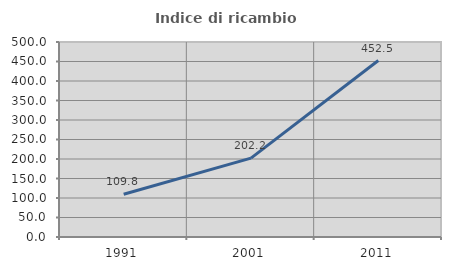
| Category | Indice di ricambio occupazionale  |
|---|---|
| 1991.0 | 109.764 |
| 2001.0 | 202.151 |
| 2011.0 | 452.486 |